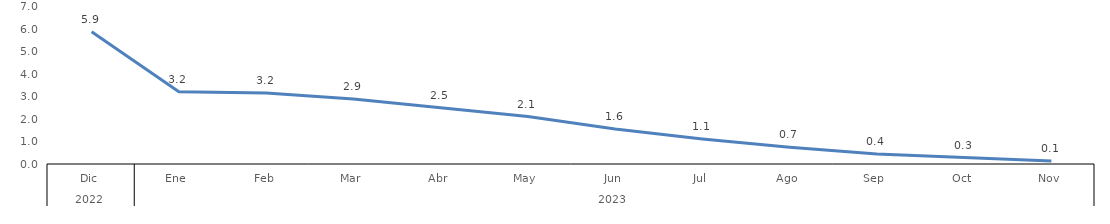
| Category | Bogotá |
|---|---|
| 0 | 5.896 |
| 1 | 3.225 |
| 2 | 3.168 |
| 3 | 2.894 |
| 4 | 2.504 |
| 5 | 2.117 |
| 6 | 1.556 |
| 7 | 1.115 |
| 8 | 0.743 |
| 9 | 0.447 |
| 10 | 0.286 |
| 11 | 0.133 |